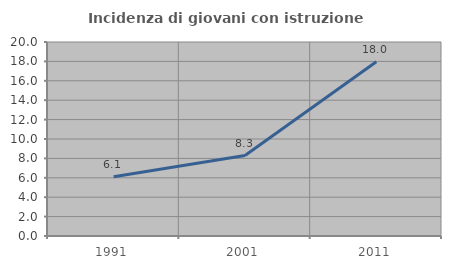
| Category | Incidenza di giovani con istruzione universitaria |
|---|---|
| 1991.0 | 6.101 |
| 2001.0 | 8.291 |
| 2011.0 | 17.957 |